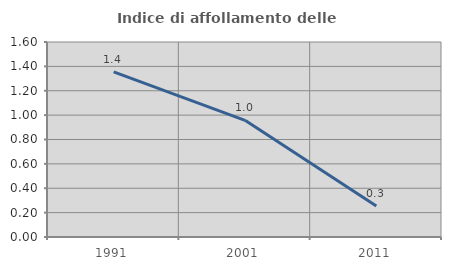
| Category | Indice di affollamento delle abitazioni  |
|---|---|
| 1991.0 | 1.354 |
| 2001.0 | 0.957 |
| 2011.0 | 0.255 |